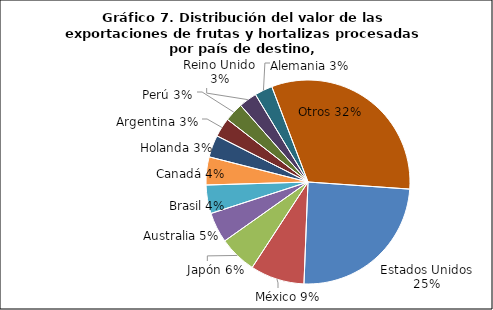
| Category | Series 0 |
|---|---|
| Estados Unidos | 354262914.69 |
| México | 123933227.18 |
| Japón | 86573988.86 |
| Australia | 69452101.53 |
| Brasil | 65277370.65 |
| Canadá | 64122462.86 |
| Holanda | 50566025.86 |
| Argentina | 43989660.79 |
| Perú | 43514033.55 |
| Reino Unido | 41454207.73 |
| Alemania | 40962671.16 |
| Otros | 460668803.59 |